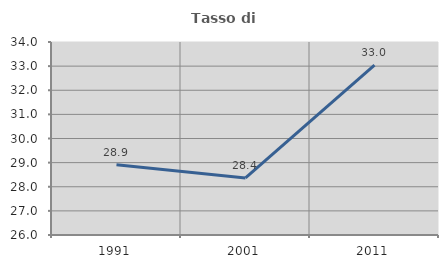
| Category | Tasso di occupazione   |
|---|---|
| 1991.0 | 28.911 |
| 2001.0 | 28.366 |
| 2011.0 | 33.046 |